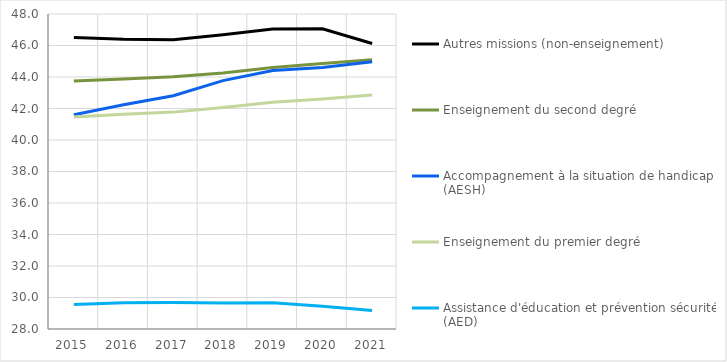
| Category | Autres missions (non-enseignement) | Enseignement du second degré | Accompagnement à la situation de handicap (AESH) | Enseignement du premier degré | Assistance d'éducation et prévention sécurité (AED) |
|---|---|---|---|---|---|
| 2015.0 | 46.51 | 43.75 | 41.6 | 41.46 | 29.56 |
| 2016.0 | 46.4 | 43.87 | 42.24 | 41.64 | 29.66 |
| 2017.0 | 46.36 | 44.01 | 42.81 | 41.77 | 29.68 |
| 2018.0 | 46.68 | 44.26 | 43.77 | 42.06 | 29.65 |
| 2019.0 | 47.05 | 44.61 | 44.41 | 42.39 | 29.66 |
| 2020.0 | 47.06 | 44.85 | 44.61 | 42.61 | 29.44 |
| 2021.0 | 46.13 | 45.1 | 44.97 | 42.86 | 29.18 |